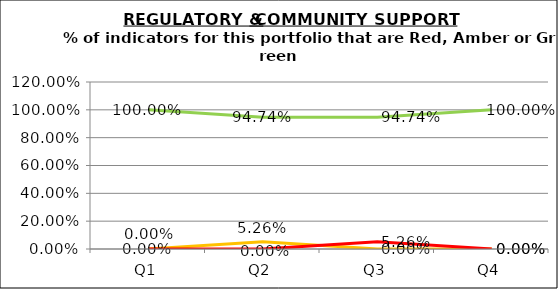
| Category | Green | Amber | Red |
|---|---|---|---|
| Q1 | 1 | 0 | 0 |
| Q2 | 0.947 | 0.053 | 0 |
| Q3 | 0.947 | 0 | 0.053 |
| Q4 | 1 | 0 | 0 |